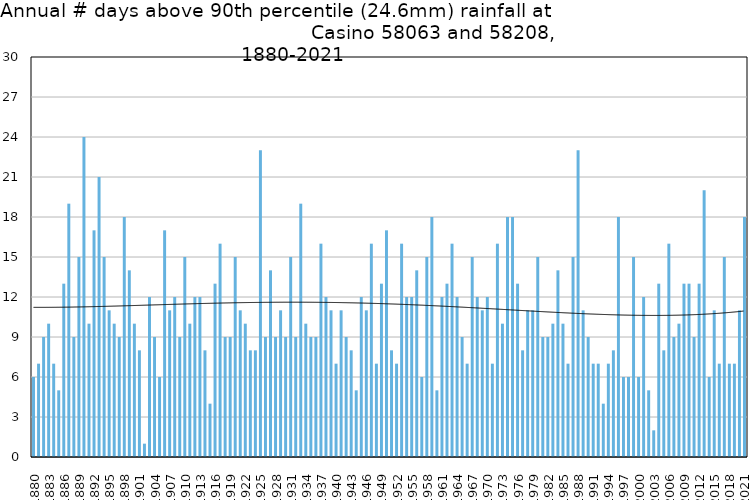
| Category | Annual # days above 90th percentile |
|---|---|
| 1880 | 6 |
| 1881 | 7 |
| 1882 | 9 |
| 1883 | 10 |
| 1884 | 7 |
| 1885 | 5 |
| 1886 | 13 |
| 1887 | 19 |
| 1888 | 9 |
| 1889 | 15 |
| 1890 | 24 |
| 1891 | 10 |
| 1892 | 17 |
| 1893 | 21 |
| 1894 | 15 |
| 1895 | 11 |
| 1896 | 10 |
| 1897 | 9 |
| 1898 | 18 |
| 1899 | 14 |
| 1900 | 10 |
| 1901 | 8 |
| 1902 | 1 |
| 1903 | 12 |
| 1904 | 9 |
| 1905 | 6 |
| 1906 | 17 |
| 1907 | 11 |
| 1908 | 12 |
| 1909 | 9 |
| 1910 | 15 |
| 1911 | 10 |
| 1912 | 12 |
| 1913 | 12 |
| 1914 | 8 |
| 1915 | 4 |
| 1916 | 13 |
| 1917 | 16 |
| 1918 | 9 |
| 1919 | 9 |
| 1920 | 15 |
| 1921 | 11 |
| 1922 | 10 |
| 1923 | 8 |
| 1924 | 8 |
| 1925 | 23 |
| 1926 | 9 |
| 1927 | 14 |
| 1928 | 9 |
| 1929 | 11 |
| 1930 | 9 |
| 1931 | 15 |
| 1932 | 9 |
| 1933 | 19 |
| 1934 | 10 |
| 1935 | 9 |
| 1936 | 9 |
| 1937 | 16 |
| 1938 | 12 |
| 1939 | 11 |
| 1940 | 7 |
| 1941 | 11 |
| 1942 | 9 |
| 1943 | 8 |
| 1944 | 5 |
| 1945 | 12 |
| 1946 | 11 |
| 1947 | 16 |
| 1948 | 7 |
| 1949 | 13 |
| 1950 | 17 |
| 1951 | 8 |
| 1952 | 7 |
| 1953 | 16 |
| 1954 | 12 |
| 1955 | 12 |
| 1956 | 14 |
| 1957 | 6 |
| 1958 | 15 |
| 1959 | 18 |
| 1960 | 5 |
| 1961 | 12 |
| 1962 | 13 |
| 1963 | 16 |
| 1964 | 12 |
| 1965 | 9 |
| 1966 | 7 |
| 1967 | 15 |
| 1968 | 12 |
| 1969 | 11 |
| 1970 | 12 |
| 1971 | 7 |
| 1972 | 16 |
| 1973 | 10 |
| 1974 | 18 |
| 1975 | 18 |
| 1976 | 13 |
| 1977 | 8 |
| 1978 | 11 |
| 1979 | 11 |
| 1980 | 15 |
| 1981 | 9 |
| 1982 | 9 |
| 1983 | 10 |
| 1984 | 14 |
| 1985 | 10 |
| 1986 | 7 |
| 1987 | 15 |
| 1988 | 23 |
| 1989 | 11 |
| 1990 | 9 |
| 1991 | 7 |
| 1992 | 7 |
| 1993 | 4 |
| 1994 | 7 |
| 1995 | 8 |
| 1996 | 18 |
| 1997 | 6 |
| 1998 | 6 |
| 1999 | 15 |
| 2000 | 6 |
| 2001 | 12 |
| 2002 | 5 |
| 2003 | 2 |
| 2004 | 13 |
| 2005 | 8 |
| 2006 | 16 |
| 2007 | 9 |
| 2008 | 10 |
| 2009 | 13 |
| 2010 | 13 |
| 2011 | 9 |
| 2012 | 13 |
| 2013 | 20 |
| 2014 | 6 |
| 2015 | 11 |
| 2016 | 7 |
| 2017 | 15 |
| 2018 | 7 |
| 2019 | 7 |
| 2020 | 11 |
| 2021 | 18 |